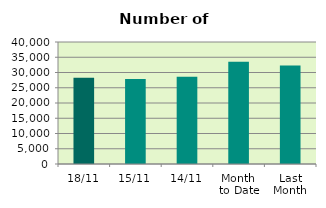
| Category | Series 0 |
|---|---|
| 18/11 | 28272 |
| 15/11 | 27840 |
| 14/11 | 28570 |
| Month 
to Date | 33538.833 |
| Last
Month | 32305.043 |